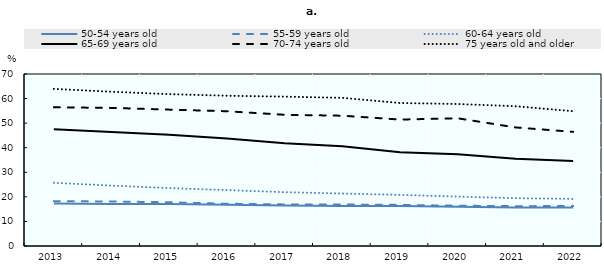
| Category | 50-54 years old | 55-59 years old | 60-64 years old | 65-69 years old | 70-74 years old | 75 years old and older |
|---|---|---|---|---|---|---|
| 2013 | 17.332 | 18.238 | 25.735 | 47.496 | 56.447 | 63.944 |
| 2014 | 17.062 | 18.125 | 24.572 | 46.438 | 56.208 | 62.78 |
| 2015 | 17.085 | 17.783 | 23.568 | 45.231 | 55.501 | 61.798 |
| 2016 | 16.78 | 17.196 | 22.762 | 43.754 | 54.843 | 61.158 |
| 2017 | 16.5 | 16.924 | 21.892 | 41.844 | 53.399 | 60.788 |
| 2018 | 16.27 | 16.887 | 21.356 | 40.584 | 53.03 | 60.299 |
| 2019 | 16.229 | 16.726 | 20.804 | 38.196 | 51.458 | 58.2 |
| 2020 | 16 | 16.392 | 20.115 | 37.338 | 51.974 | 57.789 |
| 2021 | 15.641 | 16.208 | 19.459 | 35.552 | 48.26 | 56.886 |
| 2022 | 15.715 | 16.266 | 19.169 | 34.602 | 46.456 | 54.862 |